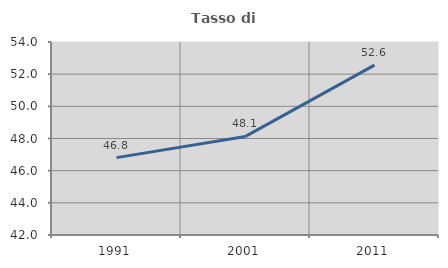
| Category | Tasso di occupazione   |
|---|---|
| 1991.0 | 46.81 |
| 2001.0 | 48.129 |
| 2011.0 | 52.562 |